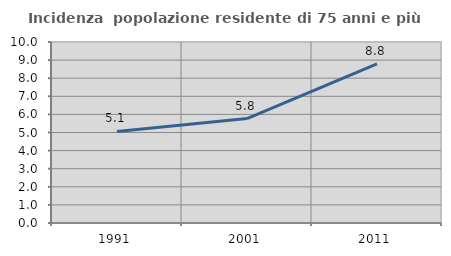
| Category | Incidenza  popolazione residente di 75 anni e più |
|---|---|
| 1991.0 | 5.061 |
| 2001.0 | 5.769 |
| 2011.0 | 8.791 |